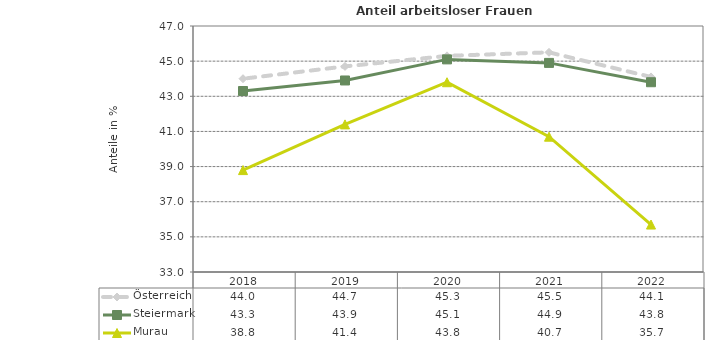
| Category | Österreich | Steiermark | Murau |
|---|---|---|---|
| 2022.0 | 44.1 | 43.8 | 35.7 |
| 2021.0 | 45.5 | 44.9 | 40.7 |
| 2020.0 | 45.3 | 45.1 | 43.8 |
| 2019.0 | 44.7 | 43.9 | 41.4 |
| 2018.0 | 44 | 43.3 | 38.8 |